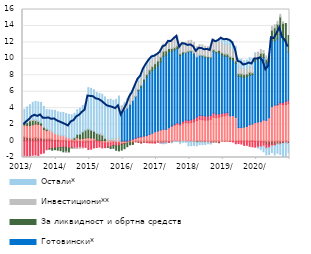
| Category | По трансакционим рачунима | Стамбени | Потрошачки | Готовински* | За ликвидност и обртна средства** | Инвестициони** | Остали* |
|---|---|---|---|---|---|---|---|
| 2013-01-01 | 0.508 | 1.431 | -1.847 | 0 | 0.247 | -0.025 | 1.661 |
| 2013-02-01 | 0.453 | 1.445 | -1.828 | 0 | 0.347 | 0.059 | 1.858 |
| 2013-03-01 | 0.396 | 1.481 | -1.809 | 0 | 0.577 | 0.174 | 1.791 |
| 2013-04-01 | 0.363 | 1.611 | -1.729 | 0 | 0.524 | 0.158 | 2.057 |
| 2013-05-01 | 0.428 | 1.629 | -1.697 | 0 | 0.421 | 0.119 | 2.236 |
| 2013-06-01 | 0.354 | 1.679 | -1.76 | 0 | 0.356 | 0.073 | 2.298 |
| 2013-07-01 | 0.377 | 1.547 | -1.534 | 0 | 0.28 | 0.055 | 2.445 |
| 2013-08-01 | 0.277 | 1.122 | -1.451 | 0 | 0.273 | 0.107 | 2.436 |
| 2013-09-01 | 0.283 | 0.981 | -1.058 | 0 | 0.173 | 0.116 | 2.267 |
| 2013-10-01 | 0.296 | 0.993 | -0.949 | 0 | -0.033 | 0.081 | 2.425 |
| 2013-11-01 | 0.234 | 0.883 | -0.898 | 0 | -0.218 | 0.069 | 2.571 |
| 2013-12-01 | 0.178 | 0.692 | -0.843 | 0 | -0.202 | 0.115 | 2.751 |
| 2014-01-01 | 0.161 | 0.59 | -0.827 | 0 | -0.283 | 0.112 | 2.704 |
| 2014-02-01 | 0.047 | 0.58 | -0.791 | 0 | -0.379 | 0.1 | 2.763 |
| 2014-03-01 | 0.093 | 0.545 | -0.742 | 0 | -0.569 | 0.016 | 2.827 |
| 2014-04-01 | 0.086 | 0.425 | -0.769 | 0 | -0.554 | -0.011 | 2.841 |
| 2014-05-01 | -0.103 | 0.39 | -0.777 | 0 | -0.503 | -0.016 | 2.846 |
| 2014-06-01 | 0.02 | 0.27 | -0.77 | 0 | -0.102 | -0.004 | 2.917 |
| 2014-07-01 | -0.1 | 0.167 | -0.769 | 0 | 0.237 | -0.031 | 2.979 |
| 2014-08-01 | -0.098 | 0.395 | -0.748 | 0 | 0.414 | -0.032 | 3.01 |
| 2014-09-01 | -0.081 | 0.267 | -0.729 | 0 | 0.594 | -0.055 | 3.145 |
| 2014-10-01 | -0.149 | 0.302 | -0.669 | 0 | 0.817 | -0.022 | 3.213 |
| 2014-11-01 | -0.14 | 0.382 | -0.636 | 0 | 0.945 | 0.036 | 3.176 |
| 2014-12-01 | -0.096 | 0.404 | -0.93 | 0 | 1.047 | 0.02 | 5.023 |
| 2015-01-01 | -0.103 | 0.371 | -0.88 | 0 | 0.971 | 0.029 | 5.041 |
| 2015-02-01 | 0.049 | 0.294 | -0.837 | 0 | 0.885 | 0.01 | 4.996 |
| 2015-03-01 | 0.079 | 0.039 | -0.79 | 0 | 0.818 | 0.043 | 4.945 |
| 2015-04-01 | 0.097 | -0.029 | -0.7 | 0 | 0.733 | 0.112 | 4.846 |
| 2015-05-01 | 0.037 | -0.211 | -0.623 | 0 | 0.663 | 0.156 | 4.828 |
| 2015-06-01 | 0.048 | -0.237 | -0.564 | 0 | 0.273 | 0.217 | 4.827 |
| 2015-07-01 | 0.011 | -0.222 | -0.512 | 0 | -0.03 | 0.258 | 4.777 |
| 2015-08-01 | 0.06 | -0.235 | -0.472 | 0 | -0.202 | 0.254 | 4.784 |
| 2015-09-01 | -0.027 | -0.077 | -0.415 | 0 | -0.356 | 0.321 | 4.643 |
| 2015-10-01 | -0.034 | -0.17 | -0.385 | 0 | -0.533 | 0.409 | 4.662 |
| 2015-11-01 | 0.008 | -0.216 | -0.356 | 0 | -0.624 | 0.491 | 4.982 |
| 2015-12-01 | -0.089 | -0.265 | -0.024 | 3.632 | -0.722 | 0.632 | 0.016 |
| 2016-01-01 | -0.127 | -0.175 | -0.021 | 3.762 | -0.611 | 0.682 | 0.257 |
| 2016-02-01 | -0.043 | -0.189 | 0.001 | 4.013 | -0.457 | 0.748 | 0.372 |
| 2016-03-01 | -0.152 | 0.065 | 0.042 | 4.376 | -0.299 | 0.899 | 0.433 |
| 2016-04-01 | -0.291 | 0.194 | 0.05 | 4.714 | -0.12 | 0.918 | 0.433 |
| 2016-05-01 | -0.108 | 0.303 | 0.059 | 5.046 | 0.031 | 0.954 | 0.425 |
| 2016-06-01 | -0.176 | 0.432 | 0.056 | 5.656 | 0.139 | 0.962 | 0.437 |
| 2016-07-01 | -0.255 | 0.503 | 0.03 | 6.024 | 0.239 | 0.947 | 0.404 |
| 2016-08-01 | -0.154 | 0.606 | 0.004 | 6.623 | 0.307 | 0.957 | 0.426 |
| 2016-09-01 | -0.178 | 0.661 | -0.02 | 7.102 | 0.348 | 1.031 | 0.396 |
| 2016-10-01 | -0.176 | 0.793 | -0.055 | 7.461 | 0.394 | 1.006 | 0.414 |
| 2016-11-01 | -0.174 | 0.952 | -0.065 | 7.609 | 0.499 | 0.969 | 0.433 |
| 2016-12-01 | -0.201 | 1.131 | -0.045 | 7.685 | 0.596 | 0.886 | 0.263 |
| 2017-01-01 | -0.106 | 1.22 | -0.024 | 7.92 | 0.595 | 0.87 | 0.053 |
| 2017-02-01 | -0.207 | 1.343 | -0.03 | 8.279 | 0.584 | 0.861 | -0.029 |
| 2017-03-01 | -0.208 | 1.424 | -0.041 | 8.897 | 0.588 | 0.894 | -0.087 |
| 2017-04-01 | -0.152 | 1.419 | -0.038 | 9.037 | 0.509 | 0.925 | -0.101 |
| 2017-05-01 | -0.139 | 1.617 | -0.009 | 9.239 | 0.4 | 0.979 | 0.036 |
| 2017-06-01 | -0.149 | 1.807 | 0.026 | 9.09 | 0.33 | 1.082 | -0.071 |
| 2017-07-01 | -0.013 | 1.938 | 0.095 | 9.039 | 0.286 | 1.153 | -0.047 |
| 2017-08-01 | -0.026 | 2.037 | 0.187 | 9.028 | 0.319 | 1.239 | -0.048 |
| 2017-09-01 | -0.096 | 1.953 | 0.144 | 8.311 | 0.208 | 1.123 | -0.228 |
| 2017-10-01 | -0.014 | 2.157 | 0.238 | 8.209 | 0.241 | 1.163 | -0.142 |
| 2017-11-01 | -0.023 | 2.254 | 0.303 | 8.195 | 0.045 | 1.16 | -0.142 |
| 2017-12-01 | -0.056 | 2.205 | 0.311 | 8.33 | 0.09 | 1.26 | -0.508 |
| 2018-01-01 | -0.081 | 2.265 | 0.327 | 8.3 | 0.083 | 1.278 | -0.481 |
| 2018-02-01 | -0.113 | 2.34 | 0.369 | 7.965 | 0.047 | 1.301 | -0.424 |
| 2018-03-01 | -0.111 | 2.495 | 0.416 | 7.335 | -0.033 | 1.25 | -0.433 |
| 2018-04-01 | -0.081 | 2.649 | 0.463 | 7.33 | -0.002 | 1.282 | -0.359 |
| 2018-05-01 | -0.115 | 2.601 | 0.491 | 7.248 | 0.078 | 1.279 | -0.329 |
| 2018-06-01 | -0.166 | 2.547 | 0.505 | 7.138 | 0.143 | 1.197 | -0.261 |
| 2018-07-01 | -0.145 | 2.554 | 0.495 | 7.101 | 0.124 | 1.2 | -0.178 |
| 2018-08-01 | -0.225 | 2.647 | 0.474 | 6.992 | 0.092 | 1.178 | -0.137 |
| 2018-09-01 | -0.14 | 2.915 | 0.498 | 7.489 | 0.205 | 1.226 | 0.07 |
| 2018-10-01 | -0.125 | 2.846 | 0.442 | 7.456 | 0.158 | 1.193 | 0.104 |
| 2018-11-01 | -0.206 | 2.929 | 0.385 | 7.416 | 0.306 | 1.244 | 0.165 |
| 2018-12-01 | -0.005 | 3.009 | 0.366 | 7.096 | 0.257 | 1.224 | 0.559 |
| 2019-01-01 | -0.045 | 3.078 | 0.343 | 6.898 | 0.267 | 1.186 | 0.594 |
| 2019-02-01 | -0.024 | 3.175 | 0.284 | 6.823 | 0.273 | 1.178 | 0.658 |
| 2019-03-01 | -0.041 | 3.067 | -0.017 | 6.909 | 0.281 | 1.148 | 0.909 |
| 2019-04-01 | -0.041 | 3.102 | -0.071 | 6.728 | 0.35 | 0.959 | 0.944 |
| 2019-05-01 | -0.101 | 2.892 | -0.229 | 6.532 | 0.332 | 0.851 | 0.917 |
| 2019-06-01 | -0.032 | 1.641 | -0.277 | 6.225 | 0.324 | 0.815 | 0.995 |
| 2019-07-01 | -0.025 | 1.64 | -0.34 | 6.167 | 0.367 | 0.718 | 1.061 |
| 2019-08-01 | -0.025 | 1.693 | -0.499 | 6.043 | 0.38 | 0.64 | 1.02 |
| 2019-09-01 | 0.002 | 1.775 | -0.51 | 6.049 | 0.332 | 0.612 | 1.07 |
| 2019-10-01 | -0.05 | 1.982 | -0.601 | 6.001 | 0.376 | 0.64 | 1.135 |
| 2019-11-01 | 0.007 | 2.063 | -0.707 | 6.01 | 0.22 | 0.687 | 1.09 |
| 2019-12-01 | -0.045 | 2.247 | -0.705 | 7.459 | 0.31 | 0.604 | 0.109 |
| 2020-01-31 | -0.067 | 2.32 | -0.682 | 7.598 | 0.358 | 0.543 | -0.107 |
| 2020-02-29 | -0.05 | 2.357 | -0.646 | 7.878 | 0.431 | 0.481 | -0.343 |
| 2020-03-31 | -0.142 | 2.559 | -0.469 | 7.592 | 0.497 | 0.362 | -0.693 |
| 2020-04-30 | -0.391 | 2.519 | -0.482 | 6.976 | 0.428 | 0.428 | -0.807 |
| 2020-05-31 | -0.497 | 2.845 | -0.315 | 6.823 | 0.636 | 0.451 | -0.835 |
| 2020-06-30 | -0.368 | 4.188 | -0.212 | 7.993 | 1.298 | 0.472 | -0.814 |
| 2020-07-31 | -0.412 | 4.363 | -0.136 | 7.827 | 1.569 | 0.389 | -1.144 |
| 2020-08-31 | -0.35 | 4.374 | 0.053 | 7.995 | 1.779 | 0.365 | -1.139 |
| 2020-09-30 | -0.363 | 4.491 | 0.175 | 8.283 | 2.132 | 0.326 | -1.274 |
| 2020-10-31 | -0.292 | 4.411 | 0.268 | 7.607 | 2.03 | 0.189 | -1.627 |
| 2020-11-30 | -0.235 | 4.434 | 0.387 | 7.362 | 2.118 | -0.01 | -1.811 |
| 2020-12-31 | -0.3 | 4.547 | 0.414 | 5.86 | 2.023 | -0.042 | -1.076 |